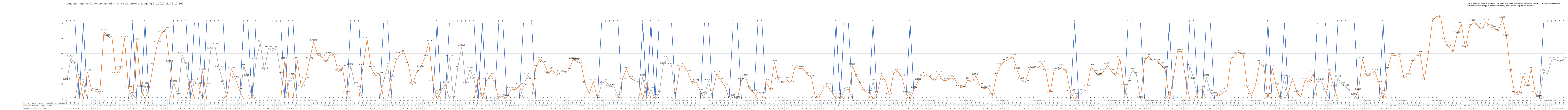
| Category | 1 = Strom reicht im Tagesdurchschnitt aus | Zusätzlich benötigter Strom | Überschüssiger Strom |
|---|---|---|---|
| 0 | 1 | 0 | 0.241 |
| 1 | 1 | 0 | 0.543 |
| 2 | 1 | 0 | 0.455 |
| 3 | 0 | 0.3 | 0 |
| 4 | 1 | 0 | 0.236 |
| 5 | 0 | 0.361 | 0 |
| 6 | 0 | 0.114 | 0 |
| 7 | 0 | 0.103 | 0 |
| 8 | 0 | 0.075 | 0 |
| 9 | 0 | 0.886 | 0 |
| 10 | 0 | 0.819 | 0 |
| 11 | 0 | 0.797 | 0 |
| 12 | 0 | 0.325 | 0 |
| 13 | 0 | 0.402 | 0 |
| 14 | 0 | 0.799 | 0 |
| 15 | 0 | 0.141 | 0 |
| 16 | 1 | 0 | 0.063 |
| 17 | 0 | 0.763 | 0 |
| 18 | 0 | 0.146 | 0 |
| 19 | 1 | 0 | 0.188 |
| 20 | 0 | 0.135 | 0 |
| 21 | 0 | 0.442 | 0 |
| 22 | 0 | 0.732 | 0 |
| 23 | 0 | 0.861 | 0 |
| 24 | 0 | 0.916 | 0 |
| 25 | 0 | 0.475 | 0 |
| 26 | 1 | 0 | 0.213 |
| 27 | 1 | 0 | 0.049 |
| 28 | 1 | 0 | 0.584 |
| 29 | 1 | 0 | 0.452 |
| 30 | 0 | 0.238 | 0 |
| 31 | 1 | 0 | 0.239 |
| 32 | 1 | 0 | 0.187 |
| 33 | 0 | 0.369 | 0 |
| 34 | 1 | 0 | 0.179 |
| 35 | 1 | 0 | 0.648 |
| 36 | 1 | 0 | 0.704 |
| 37 | 1 | 0 | 0.407 |
| 38 | 1 | 0 | 0.216 |
| 39 | 0 | 0.065 | 0 |
| 40 | 0 | 0.395 | 0 |
| 41 | 0 | 0.268 | 0 |
| 42 | 0 | 0.115 | 0 |
| 43 | 1 | 0 | 0.434 |
| 44 | 1 | 0 | 0.291 |
| 45 | 0 | 0.026 | 0 |
| 46 | 1 | 0 | 0.512 |
| 47 | 1 | 0 | 0.737 |
| 48 | 1 | 0 | 0.385 |
| 49 | 1 | 0 | 0.667 |
| 50 | 1 | 0 | 0.637 |
| 51 | 1 | 0 | 0.661 |
| 52 | 1 | 0 | 0.324 |
| 53 | 0 | 0.515 | 0 |
| 54 | 1 | 0 | 0.219 |
| 55 | 1 | 0 | 0.306 |
| 56 | 0 | 0.515 | 0 |
| 57 | 0 | 0.156 | 0 |
| 58 | 0 | 0.261 | 0 |
| 59 | 0 | 0.517 | 0 |
| 60 | 0 | 0.752 | 0 |
| 61 | 0 | 0.578 | 0 |
| 62 | 0 | 0.556 | 0 |
| 63 | 0 | 0.487 | 0 |
| 64 | 0 | 0.586 | 0 |
| 65 | 0 | 0.565 | 0 |
| 66 | 0 | 0.358 | 0 |
| 67 | 0 | 0.415 | 0 |
| 68 | 0 | 0.077 | 0 |
| 69 | 1 | 0 | 0.438 |
| 70 | 1 | 0 | 0.193 |
| 71 | 1 | 0 | 0.143 |
| 72 | 0 | 0.434 | 0 |
| 73 | 0 | 0.782 | 0 |
| 74 | 0 | 0.408 | 0 |
| 75 | 0 | 0.309 | 0 |
| 76 | 0 | 0.325 | 0 |
| 77 | 1 | 0 | 0.245 |
| 78 | 1 | 0 | 0.441 |
| 79 | 0 | 0.276 | 0 |
| 80 | 0 | 0.51 | 0 |
| 81 | 0 | 0.587 | 0 |
| 82 | 0 | 0.608 | 0 |
| 83 | 0 | 0.461 | 0 |
| 84 | 0 | 0.188 | 0 |
| 85 | 0 | 0.349 | 0 |
| 86 | 0 | 0.411 | 0 |
| 87 | 0 | 0.546 | 0 |
| 88 | 0 | 0.743 | 0 |
| 89 | 0 | 0.217 | 0 |
| 90 | 1 | 0 | 0.081 |
| 91 | 0 | 0.11 | 0 |
| 92 | 0 | 0.2 | 0 |
| 93 | 1 | 0 | 0.546 |
| 94 | 1 | 0 | 0.006 |
| 95 | 1 | 0 | 0.402 |
| 96 | 1 | 0 | 0.686 |
| 97 | 1 | 0 | 0.192 |
| 98 | 1 | 0 | 0.396 |
| 99 | 1 | 0 | 0.256 |
| 100 | 0 | 0.297 | 0 |
| 101 | 1 | 0 | 0.055 |
| 102 | 0 | 0.245 | 0 |
| 103 | 0 | 0.316 | 0 |
| 104 | 0 | 0.222 | 0 |
| 105 | 1 | 0 | 0.013 |
| 106 | 1 | 0 | 0.038 |
| 107 | 0 | 0.031 | 0 |
| 108 | 0 | 0.132 | 0 |
| 109 | 0 | 0.125 | 0 |
| 110 | 0 | 0.181 | 0 |
| 111 | 1 | 0 | 0.168 |
| 112 | 1 | 0 | 0.315 |
| 113 | 1 | 0 | 0.25 |
| 114 | 0 | 0.415 | 0 |
| 115 | 0 | 0.525 | 0 |
| 116 | 0 | 0.471 | 0 |
| 117 | 0 | 0.332 | 0 |
| 118 | 0 | 0.386 | 0 |
| 119 | 0 | 0.314 | 0 |
| 120 | 0 | 0.346 | 0 |
| 121 | 0 | 0.341 | 0 |
| 122 | 0 | 0.381 | 0 |
| 123 | 0 | 0.516 | 0 |
| 124 | 0 | 0.502 | 0 |
| 125 | 0 | 0.459 | 0 |
| 126 | 0 | 0.2 | 0 |
| 127 | 0 | 0.073 | 0 |
| 128 | 0 | 0.231 | 0 |
| 129 | 0 | 0 | 0 |
| 130 | 1 | 0 | 0.202 |
| 131 | 1 | 0 | 0.237 |
| 132 | 1 | 0 | 0.164 |
| 133 | 1 | 0 | 0.171 |
| 134 | 1 | 0 | 0.033 |
| 135 | 0 | 0.251 | 0 |
| 136 | 0 | 0.394 | 0 |
| 137 | 0 | 0.275 | 0 |
| 138 | 0 | 0.243 | 0 |
| 139 | 0 | 0.229 | 0 |
| 140 | 1 | 0 | 0.293 |
| 141 | 0 | 0.22 | 0 |
| 142 | 1 | 0 | 0.13 |
| 143 | 0 | 0.035 | 0 |
| 144 | 1 | 0 | 0.076 |
| 145 | 1 | 0 | 0.449 |
| 146 | 1 | 0 | 0.533 |
| 147 | 1 | 0 | 0.442 |
| 148 | 0 | 0.057 | 0 |
| 149 | 0 | 0.416 | 0 |
| 150 | 0 | 0.44 | 0 |
| 151 | 0 | 0.348 | 0 |
| 152 | 0 | 0.205 | 0 |
| 153 | 0 | 0.227 | 0 |
| 154 | 0 | 0.104 | 0 |
| 155 | 1 | 0 | 0.054 |
| 156 | 1 | 0 | 0.237 |
| 157 | 0 | 0.088 | 0 |
| 158 | 0 | 0.337 | 0 |
| 159 | 0 | 0.245 | 0 |
| 160 | 0 | 0.171 | 0 |
| 161 | 0 | 0.007 | 0 |
| 162 | 1 | 0 | 0.03 |
| 163 | 1 | 0 | 0.004 |
| 164 | 0 | 0.247 | 0 |
| 165 | 0 | 0.292 | 0 |
| 166 | 0 | 0.134 | 0 |
| 167 | 0 | 0.087 | 0 |
| 168 | 1 | 0 | 0.102 |
| 169 | 1 | 0 | 0.064 |
| 170 | 0 | 0.235 | 0 |
| 171 | 0 | 0.116 | 0 |
| 172 | 0 | 0.481 | 0 |
| 173 | 0 | 0.252 | 0 |
| 174 | 0 | 0.2 | 0 |
| 175 | 0 | 0.257 | 0 |
| 176 | 0 | 0.208 | 0 |
| 177 | 0 | 0.416 | 0 |
| 178 | 0 | 0.405 | 0 |
| 179 | 0 | 0.4 | 0 |
| 180 | 0 | 0.325 | 0 |
| 181 | 0 | 0.289 | 0 |
| 182 | 0 | 0.015 | 0 |
| 183 | 0 | 0.034 | 0 |
| 184 | 0 | 0.154 | 0 |
| 185 | 0 | 0.175 | 0 |
| 186 | 0 | 0.093 | 0 |
| 187 | 1 | 0 | 0.046 |
| 188 | 0 | 0.053 | 0 |
| 189 | 1 | 0 | 0.115 |
| 190 | 1 | 0 | 0.133 |
| 191 | 0 | 0.438 | 0 |
| 192 | 0 | 0.294 | 0 |
| 193 | 0 | 0.201 | 0 |
| 194 | 0 | 0.102 | 0 |
| 195 | 0 | 0.088 | 0 |
| 196 | 1 | 0 | 0.23 |
| 197 | 0 | 0.073 | 0 |
| 198 | 0 | 0.316 | 0 |
| 199 | 0 | 0.238 | 0 |
| 200 | 0 | 0.051 | 0 |
| 201 | 0 | 0.347 | 0 |
| 202 | 0 | 0.366 | 0 |
| 203 | 0 | 0.291 | 0 |
| 204 | 0 | 0.071 | 0 |
| 205 | 1 | 0 | 0.071 |
| 206 | 0 | 0.135 | 0 |
| 207 | 0 | 0.24 | 0 |
| 208 | 0 | 0.292 | 0 |
| 209 | 0 | 0.328 | 0 |
| 210 | 0 | 0.282 | 0 |
| 211 | 0 | 0.239 | 0 |
| 212 | 0 | 0.338 | 0 |
| 213 | 0 | 0.243 | 0 |
| 214 | 0 | 0.248 | 0 |
| 215 | 0 | 0.278 | 0 |
| 216 | 0 | 0.247 | 0 |
| 217 | 0 | 0.159 | 0 |
| 218 | 0 | 0.144 | 0 |
| 219 | 0 | 0.253 | 0 |
| 220 | 0 | 0.225 | 0 |
| 221 | 0 | 0.305 | 0 |
| 222 | 0 | 0.18 | 0 |
| 223 | 0 | 0.137 | 0 |
| 224 | 0 | 0.151 | 0 |
| 225 | 0 | 0.047 | 0 |
| 226 | 0 | 0.311 | 0 |
| 227 | 0 | 0.444 | 0 |
| 228 | 0 | 0.495 | 0 |
| 229 | 0 | 0.52 | 0 |
| 230 | 0 | 0.56 | 0 |
| 231 | 0 | 0.383 | 0 |
| 232 | 0 | 0.252 | 0 |
| 233 | 0 | 0.218 | 0 |
| 234 | 0 | 0.391 | 0 |
| 235 | 0 | 0.399 | 0 |
| 236 | 0 | 0.394 | 0 |
| 237 | 0 | 0.471 | 0 |
| 238 | 0 | 0.366 | 0 |
| 239 | 0 | 0.073 | 0 |
| 240 | 0 | 0.378 | 0 |
| 241 | 0 | 0.386 | 0 |
| 242 | 0 | 0.426 | 0 |
| 243 | 0 | 0.363 | 0 |
| 244 | 0 | 0.088 | 0 |
| 245 | 1 | 0 | 0.097 |
| 246 | 0 | 0.046 | 0 |
| 247 | 0 | 0.097 | 0 |
| 248 | 0 | 0.155 | 0 |
| 249 | 0 | 0.428 | 0 |
| 250 | 0 | 0.353 | 0 |
| 251 | 0 | 0.305 | 0 |
| 252 | 0 | 0.361 | 0 |
| 253 | 0 | 0.448 | 0 |
| 254 | 0 | 0.363 | 0 |
| 255 | 0 | 0.307 | 0 |
| 256 | 0 | 0.535 | 0 |
| 257 | 0 | 0.169 | 0 |
| 258 | 1 | 0 | 0.225 |
| 259 | 1 | 0 | 0.377 |
| 260 | 1 | 0 | 0.326 |
| 261 | 1 | 0 | 0.003 |
| 262 | 0 | 0.505 | 0 |
| 263 | 0 | 0.565 | 0 |
| 264 | 0 | 0.499 | 0 |
| 265 | 0 | 0.5 | 0 |
| 266 | 0 | 0.448 | 0 |
| 267 | 0 | 0.397 | 0 |
| 268 | 1 | 0 | 0.069 |
| 269 | 0 | 0.271 | 0 |
| 270 | 0 | 0.629 | 0 |
| 271 | 0 | 0.626 | 0 |
| 272 | 0 | 0.257 | 0 |
| 273 | 1 | 0 | 0.434 |
| 274 | 1 | 0 | 0.254 |
| 275 | 0 | 0.092 | 0 |
| 276 | 0 | 0.138 | 0 |
| 277 | 1 | 0 | 0.292 |
| 278 | 1 | 0 | 0.094 |
| 279 | 0 | 0.056 | 0 |
| 280 | 0 | 0.043 | 0 |
| 281 | 0 | 0.077 | 0 |
| 282 | 0 | 0.115 | 0 |
| 283 | 0 | 0.521 | 0 |
| 284 | 0 | 0.592 | 0 |
| 285 | 0 | 0.616 | 0 |
| 286 | 0 | 0.582 | 0 |
| 287 | 0 | 0.156 | 0 |
| 288 | 0 | 0.051 | 0 |
| 289 | 0 | 0.183 | 0 |
| 290 | 0 | 0.487 | 0 |
| 291 | 0 | 0.425 | 0 |
| 292 | 1 | 0 | 0.05 |
| 293 | 0 | 0.414 | 0 |
| 294 | 0 | 0.172 | 0 |
| 295 | 0 | 0.011 | 0 |
| 296 | 1 | 0 | 0.291 |
| 297 | 0 | 0.099 | 0 |
| 298 | 0 | 0.272 | 0 |
| 299 | 0 | 0.085 | 0 |
| 300 | 0 | 0.033 | 0 |
| 301 | 0 | 0.248 | 0 |
| 302 | 0 | 0.219 | 0 |
| 303 | 0 | 0.337 | 0 |
| 304 | 1 | 0 | 0.229 |
| 305 | 1 | 0 | 0.242 |
| 306 | 1 | 0 | 0.099 |
| 307 | 0 | 0.356 | 0 |
| 308 | 0 | 0.159 | 0 |
| 309 | 1 | 0 | 0.279 |
| 310 | 1 | 0 | 0.195 |
| 311 | 1 | 0 | 0.161 |
| 312 | 1 | 0 | 0.1 |
| 313 | 1 | 0 | 0.044 |
| 314 | 0 | 0.111 | 0 |
| 315 | 0 | 0.526 | 0 |
| 316 | 0 | 0.312 | 0 |
| 317 | 0 | 0.307 | 0 |
| 318 | 0 | 0.367 | 0 |
| 319 | 0 | 0.208 | 0 |
| 320 | 1 | 0 | 0.089 |
| 321 | 0 | 0.393 | 0 |
| 322 | 0 | 0.578 | 0 |
| 323 | 0 | 0.572 | 0 |
| 324 | 0 | 0.565 | 0 |
| 325 | 0 | 0.283 | 0 |
| 326 | 0 | 0.307 | 0 |
| 327 | 0 | 0.483 | 0 |
| 328 | 0 | 0.548 | 0 |
| 329 | 0 | 0.605 | 0 |
| 330 | 0 | 0.247 | 0 |
| 331 | 0 | 0.601 | 0 |
| 332 | 0 | 1.033 | 0 |
| 333 | 0 | 1.089 | 0 |
| 334 | 0 | 1.066 | 0 |
| 335 | 0 | 0.774 | 0 |
| 336 | 0 | 0.684 | 0 |
| 337 | 0 | 0.617 | 0 |
| 338 | 0 | 0.854 | 0 |
| 339 | 0 | 0.982 | 0 |
| 340 | 0 | 0.675 | 0 |
| 341 | 0 | 0.953 | 0 |
| 342 | 0 | 1.014 | 0 |
| 343 | 0 | 0.961 | 0 |
| 344 | 0 | 0.916 | 0 |
| 345 | 0 | 1.022 | 0 |
| 346 | 0 | 0.95 | 0 |
| 347 | 0 | 0.928 | 0 |
| 348 | 0 | 0.891 | 0 |
| 349 | 0 | 1.055 | 0 |
| 350 | 0 | 0.817 | 0 |
| 351 | 0 | 0.359 | 0 |
| 352 | 0 | 0.075 | 0 |
| 353 | 0 | 0.059 | 0 |
| 354 | 0 | 0.315 | 0 |
| 355 | 0 | 0.159 | 0 |
| 356 | 0 | 0.393 | 0 |
| 357 | 0 | 0.079 | 0 |
| 358 | 0 | 0.016 | 0 |
| 359 | 1 | 0 | 0.356 |
| 360 | 1 | 0 | 0.334 |
| 361 | 1 | 0 | 0.517 |
| 362 | 1 | 0 | 0.519 |
| 363 | 1 | 0 | 0.487 |
| 364 | 1 | 0 | 0.525 |